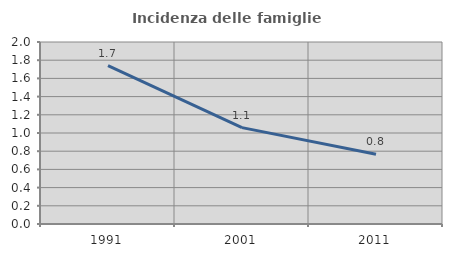
| Category | Incidenza delle famiglie numerose |
|---|---|
| 1991.0 | 1.74 |
| 2001.0 | 1.059 |
| 2011.0 | 0.767 |